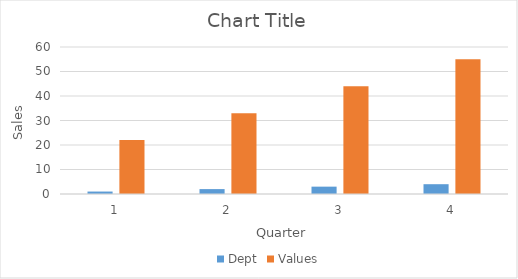
| Category | Dept | Values |
|---|---|---|
| 0 | 1 | 22 |
| 1 | 2 | 33 |
| 2 | 3 | 44 |
| 3 | 4 | 55 |